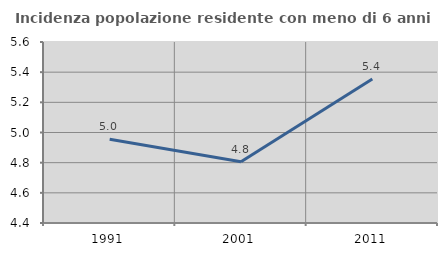
| Category | Incidenza popolazione residente con meno di 6 anni |
|---|---|
| 1991.0 | 4.955 |
| 2001.0 | 4.806 |
| 2011.0 | 5.355 |